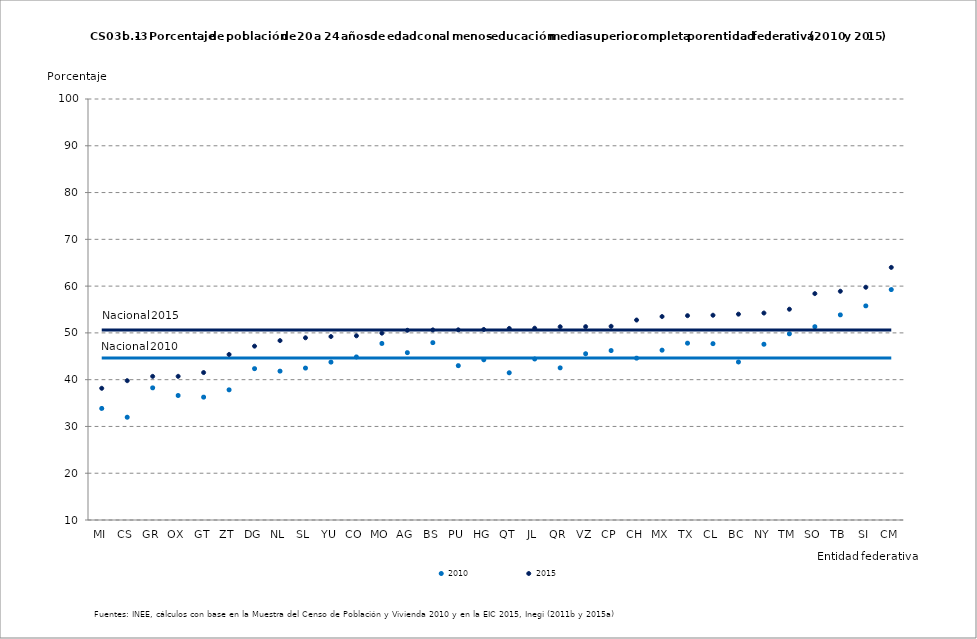
| Category | 2010 | nal2010 | 2015 | nal2015 |
|---|---|---|---|---|
| MI | 33.849 | 44.606 | 38.156 | 50.627 |
| CS | 31.969 | 44.606 | 39.782 | 50.627 |
| GR | 38.252 | 44.606 | 40.707 | 50.627 |
| OX | 36.614 | 44.606 | 40.714 | 50.627 |
| GT | 36.267 | 44.606 | 41.52 | 50.627 |
| ZT | 37.83 | 44.606 | 45.387 | 50.627 |
| DG | 42.352 | 44.606 | 47.165 | 50.627 |
| NL | 41.824 | 44.606 | 48.352 | 50.627 |
| SL | 42.478 | 44.606 | 48.954 | 50.627 |
| YU | 43.751 | 44.606 | 49.218 | 50.627 |
| CO | 44.857 | 44.606 | 49.376 | 50.627 |
| MO | 47.738 | 44.606 | 49.946 | 50.627 |
| AG | 45.775 | 44.606 | 50.556 | 50.627 |
| BS | 47.91 | 44.606 | 50.641 | 50.627 |
| PU | 42.989 | 44.606 | 50.654 | 50.627 |
| HG | 44.254 | 44.606 | 50.738 | 50.627 |
| QT | 41.474 | 44.606 | 50.955 | 50.627 |
| JL | 44.419 | 44.606 | 50.999 | 50.627 |
| QR | 42.524 | 44.606 | 51.306 | 50.627 |
| VZ | 45.543 | 44.606 | 51.332 | 50.627 |
| CP | 46.22 | 44.606 | 51.404 | 50.627 |
| CH | 44.597 | 44.606 | 52.748 | 50.627 |
| MX | 46.302 | 44.606 | 53.496 | 50.627 |
| TX | 47.801 | 44.606 | 53.681 | 50.627 |
| CL | 47.696 | 44.606 | 53.772 | 50.627 |
| BC | 43.78 | 44.606 | 54.003 | 50.627 |
| NY | 47.569 | 44.606 | 54.243 | 50.627 |
| TM | 49.799 | 44.606 | 55.06 | 50.627 |
| SO | 51.323 | 44.606 | 58.397 | 50.627 |
| TB | 53.851 | 44.606 | 58.902 | 50.627 |
| SI | 55.771 | 44.606 | 59.757 | 50.627 |
| CM | 59.258 | 44.606 | 64 | 50.627 |